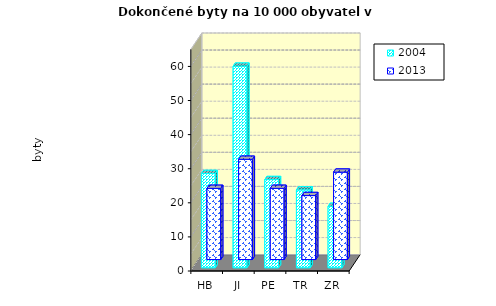
| Category | 2004 | 2013 |
|---|---|---|
| HB | 27.627 | 20.874 |
| JI | 59.115 | 29.398 |
| PE | 25.856 | 20.879 |
| TR | 22.836 | 18.762 |
| ZR | 18.009 | 25.627 |